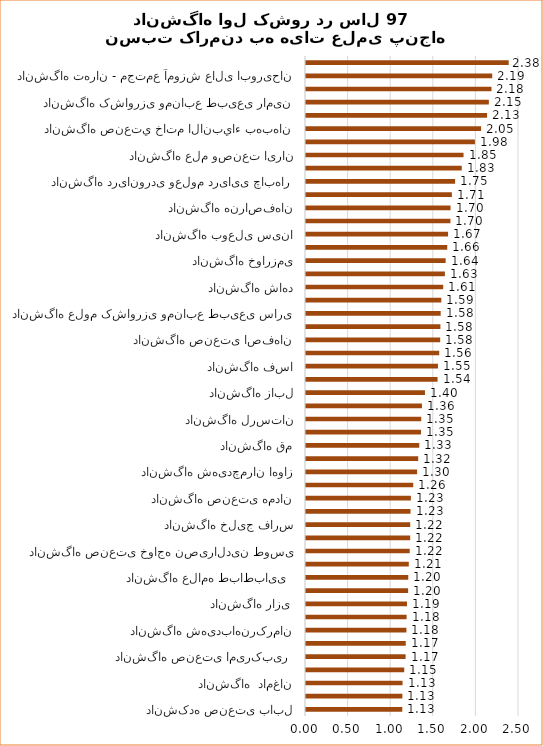
| Category |  نسبت کارمند به هیات علمی 97 |
|---|---|
| دانشکده صنعتی بابل | 1.13 |
| دانشگاه کاشان | 1.131 |
| دانشگاه  دامغان | 1.133 |
| دانشگاه فردوسی مشهد | 1.153 |
| دانشگاه صنعتی امیرکبیر  | 1.169 |
| دانشگاه صنعتی سهند  | 1.171 |
| دانشگاه شهیدباهنرکرمان | 1.179 |
| دانشگاه صنعتی شیراز | 1.181 |
| دانشگاه رازی  | 1.185 |
| دانشگاه ارومیه  | 1.199 |
| دانشگاه علامه طباطبایی  | 1.2 |
| دانشگاه الزهرا | 1.207 |
| دانشگاه صنعتی خواجه نصیرالدین طوسی | 1.218 |
| دانشگاه صنعتی شریف | 1.223 |
| دانشگاه خلیج فارس | 1.223 |
| دانشگاه تربیت مدرس | 1.227 |
| دانشگاه صنعتی همدان | 1.231 |
| دانشگاه علوم کشاورزی ومنابع طبیعی گرگان  | 1.259 |
| دانشگاه شهیدچمران اهواز | 1.304 |
| دانشگاه سمنان | 1.317 |
| دانشگاه قم | 1.33 |
| دانشگاه ایلام  | 1.35 |
| دانشگاه لرستان | 1.352 |
| دانشگاه مازندران | 1.361 |
| دانشگاه زابل | 1.396 |
| دانشگاه تفرش | 1.544 |
| دانشگاه فسا | 1.549 |
| دانشگاه  جهرم | 1.564 |
| دانشگاه صنعتی اصفهان | 1.575 |
| دانشگاه تهران - مجتمع آموزش عالي قم | 1.578 |
| دانشگاه علوم کشاورزی ومنابع طبیعی ساری  | 1.581 |
| دانشگاه ولايت | 1.588 |
| دانشگاه شاهد | 1.61 |
| دانشگاه شیراز | 1.63 |
| دانشگاه خوارزمی | 1.639 |
| دانشگاه علوم وفنون دريائي خرمشهر | 1.658 |
| دانشگاه بوعلی سینا | 1.668 |
| دانشگاه اصفهان | 1.695 |
| دانشگاه هنراصفهان | 1.696 |
| دانشگاه صنعتی جندی شاپوردزفول | 1.712 |
| دانشگاه دریانوردی وعلوم دریایی چابهار | 1.75 |
| دانشگاه سیستان وبلوچستان | 1.828 |
| دانشگاه علم وصنعت ایران | 1.849 |
| دانشگاه صنعتي اراک | 1.983 |
| دانشگاه صنعتي خاتم الانبياء بهبهان | 2.055 |
| دانشگاه تهران | 2.125 |
| دانشگاه کشاورزی ومنابع طبیعی رامین | 2.146 |
| دانشگاه هنر | 2.177 |
| دانشگاه تهران - مجتمع آموزش عالی ابوریحان | 2.186 |
| دانشگاه تهران - دانشکده کشاورزی ومنابع طبیعی  | 2.379 |